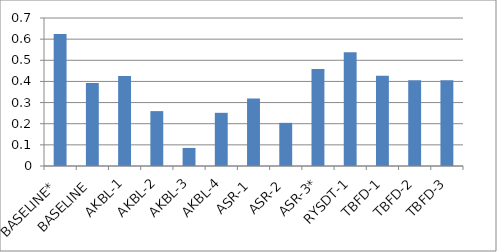
| Category | MAP |
|---|---|
| BASELINE* | 0.624 |
| BASELINE | 0.393 |
| AKBL-1 | 0.426 |
| AKBL-2 | 0.26 |
| AKBL-3 | 0.085 |
| AKBL-4 | 0.252 |
| ASR-1 | 0.319 |
| ASR-2 | 0.204 |
| ASR-3* | 0.458 |
| RYSDT-1 | 0.539 |
| TBFD-1 | 0.427 |
| TBFD-2 | 0.405 |
| TBFD-3 | 0.406 |